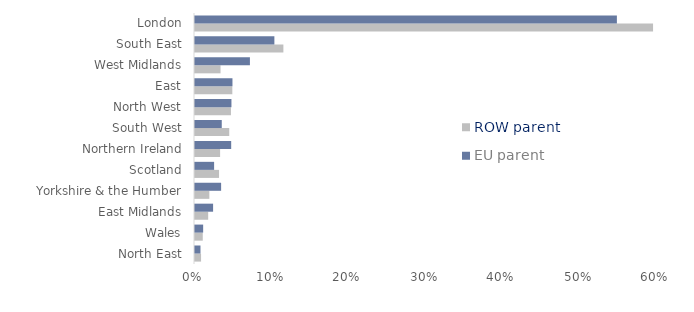
| Category | ROW parent | EU parent |
|---|---|---|
| North East | 0.008 | 0.007 |
| Wales | 0.01 | 0.011 |
| East Midlands | 0.017 | 0.023 |
| Yorkshire & the Humber | 0.019 | 0.034 |
| Scotland | 0.031 | 0.025 |
| Northern Ireland | 0.033 | 0.047 |
| South West | 0.044 | 0.035 |
| North West | 0.047 | 0.047 |
| East | 0.048 | 0.049 |
| West Midlands | 0.033 | 0.071 |
| South East | 0.115 | 0.103 |
| London | 0.595 | 0.548 |